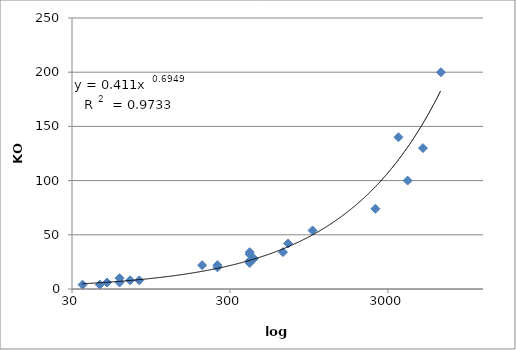
| Category | Series 0 |
|---|---|
| 35.0 | 4 |
| 45.0 | 4 |
| 50.0 | 6 |
| 60.0 | 6 |
| 60.0 | 10 |
| 70.0 | 8 |
| 80.0 | 8 |
| 200.0 | 22 |
| 250.0 | 20 |
| 250.0 | 22 |
| 400.0 | 24 |
| 400.0 | 26 |
| 400.0 | 32 |
| 400.0 | 34 |
| 425.0 | 28 |
| 650.0 | 34 |
| 700.0 | 42 |
| 1000.0 | 54 |
| 2500.0 | 74 |
| 3500.0 | 140 |
| 4000.0 | 100 |
| 5000.0 | 130 |
| 6500.0 | 200 |